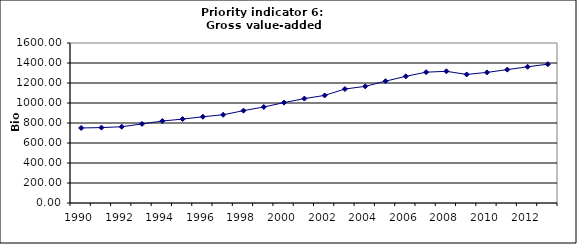
| Category | Gross value-added services, Bio Euro (EC95) |
|---|---|
| 1990 | 750.396 |
| 1991 | 754.204 |
| 1992 | 762.684 |
| 1993 | 790.619 |
| 1994 | 819.724 |
| 1995 | 838.995 |
| 1996 | 862.481 |
| 1997 | 882.423 |
| 1998 | 923.531 |
| 1999 | 960.068 |
| 2000 | 1003.985 |
| 2001 | 1044.036 |
| 2002 | 1075.993 |
| 2003 | 1139.743 |
| 2004 | 1166.558 |
| 2005 | 1218.163 |
| 2006 | 1266.836 |
| 2007 | 1308.342 |
| 2008 | 1316.935 |
| 2009 | 1285.581 |
| 2010 | 1306.106 |
| 2011 | 1333.634 |
| 2012 | 1362.16 |
| 2013 | 1388.212 |